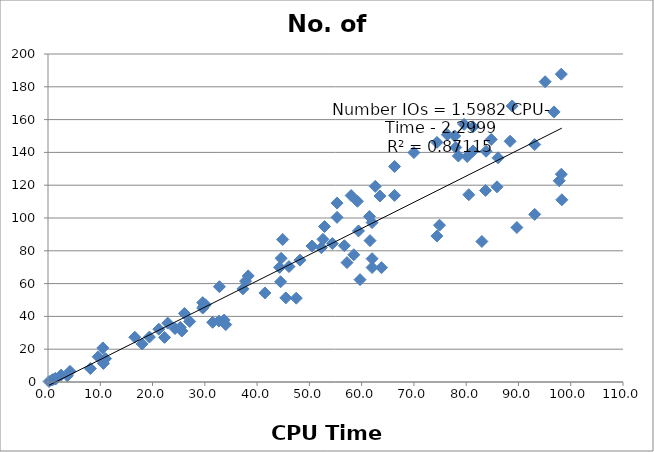
| Category | No. of IOs |
|---|---|
| 1.5 | 1.9 |
| 84.8 | 147.9 |
| 85.9 | 119 |
| 3.7 | 3.8 |
| 96.8 | 164.7 |
| 48.2 | 74.3 |
| 25.3 | 33.3 |
| 29.8 | 46.1 |
| 8.1 | 8.2 |
| 44.3 | 69.9 |
| 37.3 | 56.8 |
| 38.3 | 64.7 |
| 89.7 | 94.2 |
| 78.5 | 137.8 |
| 58.5 | 77.6 |
| 54.4 | 84.4 |
| 1.3 | 1.8 |
| 44.9 | 86.9 |
| 98.2 | 187.7 |
| 52.6 | 87 |
| 88.4 | 146.8 |
| 61.6 | 86.2 |
| 55.3 | 109.1 |
| 80.5 | 114.2 |
| 56.7 | 83.1 |
| 77.8 | 150 |
| 59.7 | 62.4 |
| 62.0 | 97.2 |
| 31.5 | 36.4 |
| 95.1 | 183.1 |
| 74.9 | 95.6 |
| 41.5 | 54.3 |
| 0.8 | 1.2 |
| 63.5 | 113.4 |
| 1.4 | 2.2 |
| 62.0 | 75.2 |
| 93.1 | 102.2 |
| 79.6 | 157.1 |
| 59.2 | 110.2 |
| 19.4 | 27.4 |
| 21.2 | 32.2 |
| 83.8 | 140.7 |
| 74.4 | 146.1 |
| 57.2 | 72.8 |
| 97.8 | 122.7 |
| 45.5 | 51.3 |
| 83.7 | 116.8 |
| 59.4 | 92.1 |
| 22.9 | 35.9 |
| 63.8 | 69.7 |
| 16.6 | 27.3 |
| 47.5 | 51.1 |
| 61.5 | 100.9 |
| 32.8 | 58.1 |
| 29.6 | 45.1 |
| 80.2 | 137.5 |
| 44.5 | 61.1 |
| 50.5 | 82.9 |
| 76.4 | 150.8 |
| 2.5 | 4.2 |
| 0.2 | 0.3 |
| 18.0 | 23.2 |
| 22.3 | 27.2 |
| 93.1 | 144.8 |
| 37.8 | 61.5 |
| 34.0 | 35 |
| 66.3 | 131.4 |
| 10.6 | 11.3 |
| 11.0 | 14.2 |
| 4.2 | 6.5 |
| 74.4 | 89 |
| 10.5 | 20.8 |
| 62.6 | 119.3 |
| 25.6 | 31.1 |
| 81.3 | 140.9 |
| 29.6 | 48.4 |
| 78.0 | 143 |
| 52.9 | 94.8 |
| 9.6 | 15.4 |
| 46.1 | 70.4 |
| 88.8 | 168.3 |
| 30.1 | 47.1 |
| 55.3 | 100.4 |
| 24.3 | 32.6 |
| 98.3 | 111.1 |
| 81.3 | 155.6 |
| 70.0 | 139.9 |
| 62.0 | 69.8 |
| 58.0 | 113.7 |
| 98.2 | 126.7 |
| 27.1 | 36.9 |
| 66.3 | 113.8 |
| 26.1 | 41.8 |
| 33.7 | 37.8 |
| 0.9 | 1.4 |
| 86.1 | 136.7 |
| 52.3 | 81.9 |
| 32.7 | 37.1 |
| 44.6 | 75.4 |
| 83.0 | 85.7 |